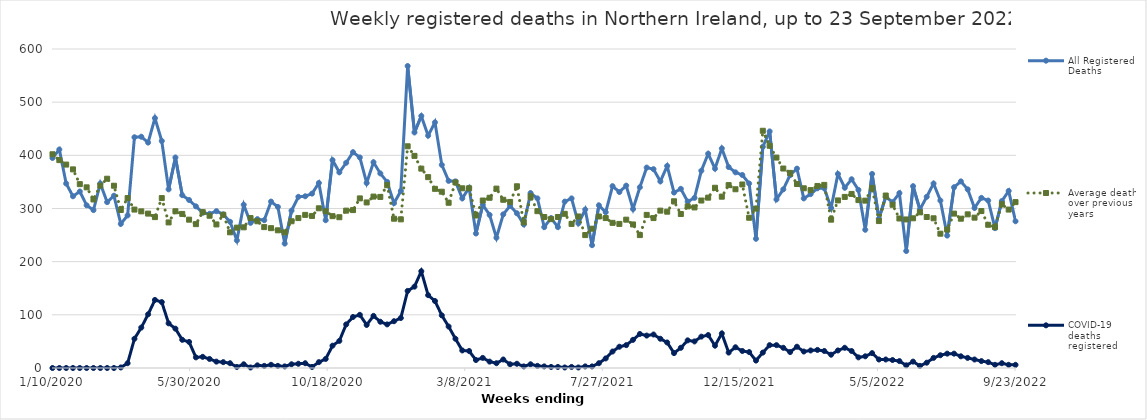
| Category | All Registered Deaths | Average deaths over previous 5 years | COVID-19 deaths registered |
|---|---|---|---|
| 1/10/20 | 395 | 402 | 0 |
| 1/17/20 | 411 | 391 | 0 |
| 1/24/20 | 347 | 382.6 | 0 |
| 1/31/20 | 323 | 373.6 | 0 |
| 2/7/20 | 332 | 345.8 | 0 |
| 2/14/20 | 306 | 339.8 | 0 |
| 2/21/20 | 297 | 317 | 0 |
| 2/28/20 | 347 | 343 | 0 |
| 3/6/20 | 312 | 356 | 0 |
| 3/13/20 | 324 | 342.8 | 0 |
| 3/20/20 | 271 | 297.2 | 1 |
| 3/27/20 | 287 | 319.6 | 9 |
| 4/3/20 | 434 | 298 | 55 |
| 4/10/20 | 435 | 294.6 | 76 |
| 4/17/20 | 424 | 290.4 | 101 |
| 4/24/20 | 470 | 283.8 | 128 |
| 5/1/20 | 427 | 319.6 | 124 |
| 5/8/20 | 336 | 273.8 | 84 |
| 5/15/20 | 396 | 294.8 | 74 |
| 5/22/20 | 325 | 289.8 | 53 |
| 5/29/20 | 316 | 279 | 49 |
| 6/5/20 | 304 | 270.6 | 20 |
| 6/12/20 | 292 | 293.2 | 21 |
| 6/19/20 | 290 | 286.4 | 17 |
| 6/26/20 | 295 | 270 | 12 |
| 7/3/20 | 289 | 288.2 | 11 |
| 7/10/20 | 275 | 255.2 | 9 |
| 7/17/20 | 240 | 264 | 2 |
| 7/24/20 | 307 | 264.6 | 7 |
| 7/31/20 | 273 | 282 | 1 |
| 8/7/20 | 280 | 276 | 5 |
| 8/14/20 | 278 | 265 | 4 |
| 8/21/20 | 313 | 263 | 6 |
| 8/28/20 | 303 | 259 | 4 |
| 9/4/20 | 234 | 255 | 3 |
| 9/11/20 | 296 | 276 | 7 |
| 9/18/20 | 322 | 282 | 8 |
| 9/25/20 | 323 | 288 | 9 |
| 10/2/20 | 328 | 286 | 2 |
| 10/9/20 | 348 | 300.4 | 11 |
| 10/16/20 | 278 | 294.8 | 17 |
| 10/23/20 | 391 | 285.6 | 42 |
| 10/30/20 | 368 | 283.6 | 51 |
| 11/6/20 | 386 | 296 | 82 |
| 11/13/20 | 406 | 297 | 96 |
| 11/20/20 | 396 | 319 | 100 |
| 11/27/20 | 348 | 311.4 | 81 |
| 12/4/20 | 387 | 322.4 | 98 |
| 12/11/20 | 366 | 321.8 | 87 |
| 12/18/20 | 350 | 343.8 | 82 |
| 12/25/20 | 310 | 280.8 | 88 |
| 1/1/21 | 333 | 279.6 | 94 |
| 1/8/21 | 568 | 417 | 145 |
| 1/15/21 | 443 | 399 | 153 |
| 1/22/21 | 474 | 375 | 182 |
| 1/29/21 | 437 | 359 | 137 |
| 2/5/21 | 462 | 337 | 126 |
| 2/12/21 | 382 | 331.6 | 99 |
| 2/19/21 | 352 | 310.8 | 78 |
| 2/26/21 | 351 | 349 | 55 |
| 3/5/21 | 319 | 338 | 33 |
| 3/12/21 | 339 | 338 | 32 |
| 3/19/21 | 253 | 286.8 | 15 |
| 3/26/21 | 307 | 315 | 19 |
| 4/2/21 | 288 | 320.2 | 12 |
| 4/9/21 | 245 | 337.4 | 9 |
| 4/16/21 | 289 | 316.4 | 16 |
| 4/23/21 | 305 | 312.4 | 7 |
| 4/30/21 | 291 | 341.8 | 8 |
| 5/7/21 | 270 | 274 | 3 |
| 5/14/21 | 329 | 323 | 7 |
| 5/21/21 | 319 | 295 | 4 |
| 5/28/21 | 265 | 284 | 3 |
| 6/4/21 | 282 | 280 | 2 |
| 6/11/21 | 265 | 284 | 2 |
| 6/18/21 | 313 | 290 | 1 |
| 6/25/21 | 319 | 271 | 2 |
| 7/2/21 | 272 | 285 | 1 |
| 7/9/21 | 298 | 250 | 3 |
| 7/16/21 | 231 | 262 | 3 |
| 7/23/21 | 306 | 285 | 9 |
| 7/30/21 | 293 | 282 | 18 |
| 8/6/21 | 342 | 273 | 31 |
| 8/13/21 | 331 | 271 | 40 |
| 8/20/21 | 343 | 279 | 43 |
| 8/27/21 | 299 | 270 | 53 |
| 9/3/21 | 340 | 250 | 64 |
| 9/10/21 | 377 | 288 | 61 |
| 9/17/21 | 374 | 282 | 63 |
| 9/24/21 | 351 | 296 | 55 |
| 10/1/21 | 380 | 294 | 48 |
| 10/8/21 | 330 | 313.6 | 28 |
| 10/15/21 | 337 | 289.6 | 38 |
| 10/22/21 | 313 | 304 | 52 |
| 10/29/21 | 320 | 302 | 50 |
| 11/5/21 | 371 | 315 | 59 |
| 11/12/21 | 403 | 320.4 | 62 |
| 11/19/21 | 375 | 339 | 42 |
| 11/26/21 | 413 | 322.2 | 65 |
| 12/3/21 | 378 | 344 | 29 |
| 12/10/21 | 368 | 336.2 | 39 |
| 12/17/21 | 363 | 345.2 | 32 |
| 12/24/21 | 347 | 282.6 | 30 |
| 12/31/21 | 243 | 299.8 | 14 |
| 1/7/22 | 416 | 446.2 | 29 |
| 1/14/22 | 445 | 418 | 43 |
| 1/21/22 | 317 | 395.8 | 43 |
| 1/28/22 | 336 | 375.2 | 38 |
| 2/4/22 | 363 | 367 | 30 |
| 2/11/22 | 375 | 346 | 40 |
| 2/18/22 | 319 | 338 | 31 |
| 2/25/22 | 327 | 334.6 | 33 |
| 3/4/22 | 338 | 342.4 | 34 |
| 3/11/22 | 338 | 344.4 | 32 |
| 3/18/22 | 301 | 279 | 25 |
| 3/25/22 | 365 | 315.2 | 33 |
| 4/1/22 | 339 | 321.8 | 38 |
| 4/8/22 | 355 | 327.4 | 32 |
| 4/15/22 | 335 | 315.8 | 20 |
| 4/22/22 | 260 | 314.8 | 22 |
| 4/29/22 | 365 | 338.8 | 28 |
| 5/6/22 | 281 | 276.4 | 16 |
| 5/13/22 | 322 | 324.4 | 16 |
| 5/20/22 | 312 | 307 | 15 |
| 5/27/22 | 329 | 281.2 | 13 |
| 6/3/22 | 220 | 279.4 | 5 |
| 6/10/22 | 342 | 281.6 | 12 |
| 6/17/22 | 298 | 292.8 | 4 |
| 6/24/22 | 322 | 284 | 10 |
| 7/1/22 | 347 | 281.6 | 19 |
| 7/8/22 | 315 | 252.6 | 24 |
| 7/15/22 | 249 | 260.4 | 27 |
| 7/22/22 | 340 | 290.4 | 27 |
| 7/29/22 | 351 | 280.8 | 22 |
| 8/5/22 | 336 | 289 | 19 |
| 8/12/22 | 301 | 282.8 | 16 |
| 8/19/22 | 320 | 295.2 | 13 |
| 8/26/22 | 315 | 269.4 | 11 |
| 9/2/22 | 263 | 265 | 6 |
| 9/9/22 | 314 | 308 | 9 |
| 9/16/22 | 333 | 298 | 6 |
| 9/23/22 | 276 | 312 | 6 |